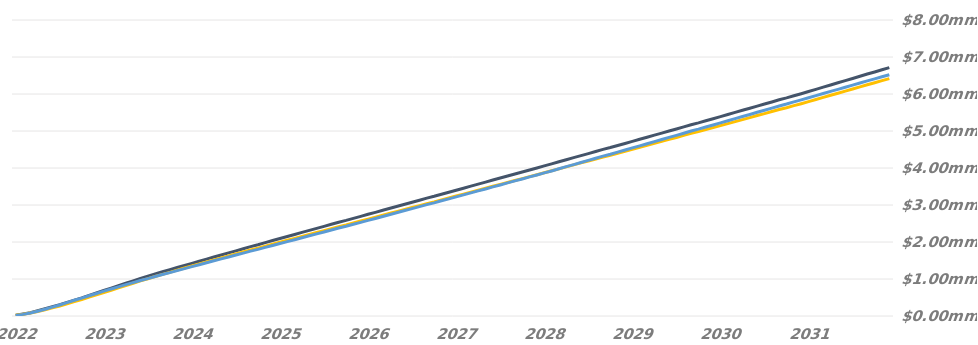
| Category | Cumulative Interest |
|---|---|
| 2022-05-23 | 16878.758 |
| 2022-06-23 | 44180.894 |
| 2022-07-23 | 83059.391 |
| 2022-08-23 | 129613.76 |
| 2022-09-23 | 180736.104 |
| 2022-10-23 | 238842.279 |
| 2022-11-23 | 298084.363 |
| 2022-12-23 | 362007.606 |
| 2023-01-23 | 426027.223 |
| 2023-02-23 | 483540.39 |
| 2023-03-23 | 547214.677 |
| 2023-04-23 | 608834.468 |
| 2023-05-23 | 672508.755 |
| 2023-06-23 | 729288.86 |
| 2023-07-23 | 787961.215 |
| 2023-08-23 | 846633.571 |
| 2023-09-23 | 903412.633 |
| 2023-10-23 | 958157.772 |
| 2023-11-23 | 1011136.835 |
| 2023-12-23 | 1065881.328 |
| 2024-01-23 | 1120626.467 |
| 2024-02-23 | 1171839.431 |
| 2024-03-23 | 1226584.355 |
| 2024-04-23 | 1279563.417 |
| 2024-05-23 | 1334307.91 |
| 2024-06-23 | 1385625.488 |
| 2024-07-23 | 1438653.309 |
| 2024-08-23 | 1491681.129 |
| 2024-09-23 | 1542998.473 |
| 2024-10-23 | 1596025.886 |
| 2024-11-23 | 1647343.23 |
| 2024-12-23 | 1700370.643 |
| 2025-01-23 | 1753398.464 |
| 2025-02-23 | 1801240.709 |
| 2025-03-23 | 1854209.113 |
| 2025-04-23 | 1905469.191 |
| 2025-05-23 | 1958437.594 |
| 2025-06-23 | 2009697.438 |
| 2025-07-23 | 2062666.057 |
| 2025-08-23 | 2115634.46 |
| 2025-09-23 | 2166893.861 |
| 2025-10-23 | 2220175.135 |
| 2025-11-23 | 2271774.953 |
| 2025-12-23 | 2325094.714 |
| 2026-01-23 | 2378415.073 |
| 2026-02-23 | 2426575.3 |
| 2026-03-23 | 2479895.06 |
| 2026-04-23 | 2531495.529 |
| 2026-05-23 | 2584815.697 |
| 2026-06-23 | 2636415.514 |
| 2026-07-23 | 2690265.696 |
| 2026-08-23 | 2744115.662 |
| 2026-09-23 | 2796228.188 |
| 2026-10-23 | 2850078.154 |
| 2026-11-23 | 2902191.591 |
| 2026-12-23 | 2956041.773 |
| 2027-01-23 | 3009891.954 |
| 2027-02-23 | 3058530.449 |
| 2027-03-23 | 3112973.338 |
| 2027-04-23 | 3165659.901 |
| 2027-05-23 | 3220102.574 |
| 2027-06-23 | 3272788.668 |
| 2027-07-23 | 3327231.557 |
| 2027-08-23 | 3381674.23 |
| 2027-09-23 | 3434360.793 |
| 2027-10-23 | 3488803.036 |
| 2027-11-23 | 3542099.625 |
| 2027-12-23 | 3597172.416 |
| 2028-01-23 | 3652245.208 |
| 2028-02-23 | 3703765.146 |
| 2028-03-23 | 3758837.938 |
| 2028-04-23 | 3812134.292 |
| 2028-05-23 | 3867207.084 |
| 2028-06-23 | 3920502.969 |
| 2028-07-23 | 3978099.773 |
| 2028-08-23 | 4035696.099 |
| 2028-09-23 | 4091435.057 |
| 2028-10-23 | 4149031.861 |
| 2028-11-23 | 4204770.299 |
| 2028-12-23 | 4262367.342 |
| 2029-01-23 | 4319964.146 |
| 2029-02-23 | 4371986.85 |
| 2029-03-23 | 4429582.697 |
| 2029-04-23 | 4485320.614 |
| 2029-05-23 | 4542916.461 |
| 2029-06-23 | 4598654.378 |
| 2029-07-23 | 4656250.225 |
| 2029-08-23 | 4713846.072 |
| 2029-09-23 | 4769583.989 |
| 2029-10-23 | 4827179.836 |
| 2029-11-23 | 4882917.753 |
| 2029-12-23 | 4940513.6 |
| 2030-01-23 | 4998109.447 |
| 2030-02-23 | 5050131.503 |
| 2030-03-23 | 5107727.35 |
| 2030-04-23 | 5163465.266 |
| 2030-05-23 | 5221061.114 |
| 2030-06-23 | 5276799.03 |
| 2030-07-23 | 5334394.878 |
| 2030-08-23 | 5391990.725 |
| 2030-09-23 | 5447728.641 |
| 2030-10-23 | 5505324.489 |
| 2030-11-23 | 5561062.405 |
| 2030-12-23 | 5618658.253 |
| 2031-01-23 | 5676254.1 |
| 2031-02-23 | 5728276.155 |
| 2031-03-23 | 5785872.003 |
| 2031-04-23 | 5841609.919 |
| 2031-05-23 | 5899205.766 |
| 2031-06-23 | 5954943.683 |
| 2031-07-23 | 6012539.53 |
| 2031-08-23 | 6070135.378 |
| 2031-09-23 | 6125873.294 |
| 2031-10-23 | 6183469.141 |
| 2031-11-23 | 6239207.058 |
| 2031-12-23 | 6296802.905 |
| 2032-01-23 | 6354398.753 |
| 2032-02-23 | 6408278.739 |
| 2032-03-23 | 6465874.586 |
| 2032-04-23 | 6521612.503 |